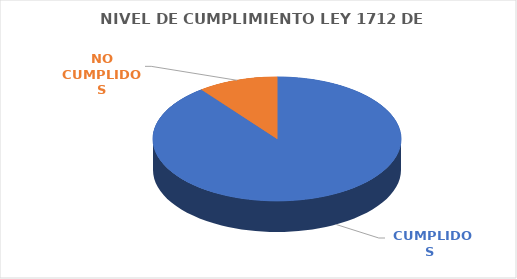
| Category | Series 0 |
|---|---|
|  CUMPLIDOS | 103 |
| NO CUMPLIDOS | 12 |